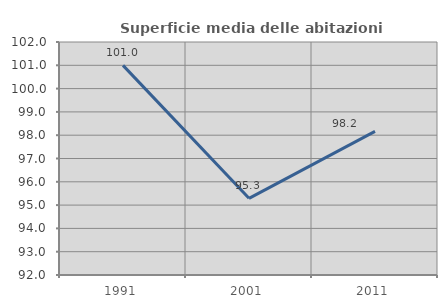
| Category | Superficie media delle abitazioni occupate |
|---|---|
| 1991.0 | 100.996 |
| 2001.0 | 95.291 |
| 2011.0 | 98.164 |